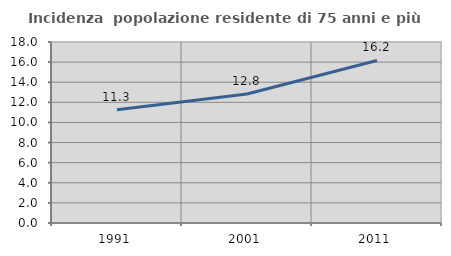
| Category | Incidenza  popolazione residente di 75 anni e più |
|---|---|
| 1991.0 | 11.258 |
| 2001.0 | 12.833 |
| 2011.0 | 16.168 |